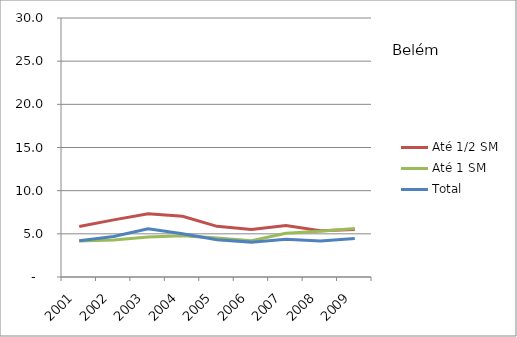
| Category | Até 1/2 SM | Até 1 SM | Total |
|---|---|---|---|
| 2001.0 | 5.84 | 4.18 | 4.21 |
| 2002.0 | 6.62 | 4.29 | 4.7 |
| 2003.0 | 7.32 | 4.63 | 5.59 |
| 2004.0 | 7.03 | 4.78 | 5 |
| 2005.0 | 5.87 | 4.51 | 4.31 |
| 2006.0 | 5.5 | 4.2 | 4.04 |
| 2007.0 | 5.96 | 5.07 | 4.37 |
| 2008.0 | 5.37 | 5.29 | 4.17 |
| 2009.0 | 5.49 | 5.63 | 4.47 |